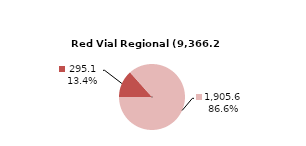
| Category | RV Departamental |
|---|---|
| Pavimentada | 295.064 |
| No Pavimentada | 1905.56 |